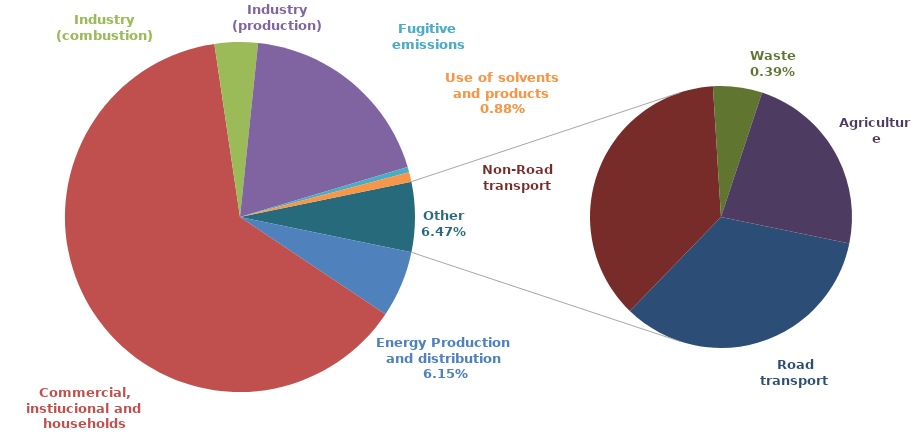
| Category | Series 0 |
|---|---|
| Energy Production and distribution | 0.061 |
| Commercial, instiucional and households | 0.633 |
| Industry (combustion) | 0.04 |
| Industry (production) | 0.187 |
| Fugitive emissions | 0.005 |
| Use of solvents and products | 0.009 |
| Road transport | 0.022 |
| Non-Road transport | 0.024 |
| Waste | 0.004 |
| Agriculture | 0.015 |